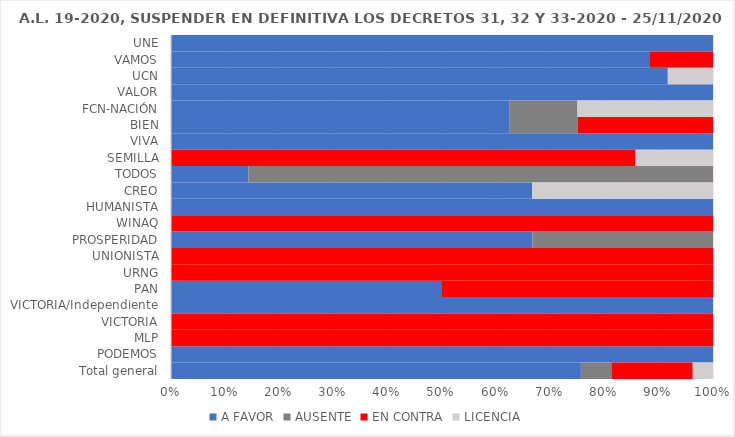
| Category | A FAVOR | AUSENTE | EN CONTRA | LICENCIA |
|---|---|---|---|---|
| UNE | 1 | 0 | 0 | 0 |
| VAMOS | 0.882 | 0 | 0.118 | 0 |
| UCN | 0.917 | 0 | 0 | 0.083 |
| VALOR | 1 | 0 | 0 | 0 |
| FCN-NACIÓN | 0.625 | 0.125 | 0 | 0.25 |
| BIEN | 0.625 | 0.125 | 0.25 | 0 |
| VIVA | 1 | 0 | 0 | 0 |
| SEMILLA | 0 | 0 | 0.857 | 0.143 |
| TODOS | 0.143 | 0.857 | 0 | 0 |
| CREO | 0.667 | 0 | 0 | 0.333 |
| HUMANISTA | 1 | 0 | 0 | 0 |
| WINAQ | 0 | 0 | 1 | 0 |
| PROSPERIDAD | 0.667 | 0.333 | 0 | 0 |
| UNIONISTA | 0 | 0 | 1 | 0 |
| URNG | 0 | 0 | 1 | 0 |
| PAN | 0.5 | 0 | 0.5 | 0 |
| VICTORIA/Independiente | 1 | 0 | 0 | 0 |
| VICTORIA | 0 | 0 | 1 | 0 |
| MLP | 0 | 0 | 1 | 0 |
| PODEMOS | 1 | 0 | 0 | 0 |
| Total general | 0.756 | 0.056 | 0.15 | 0.038 |